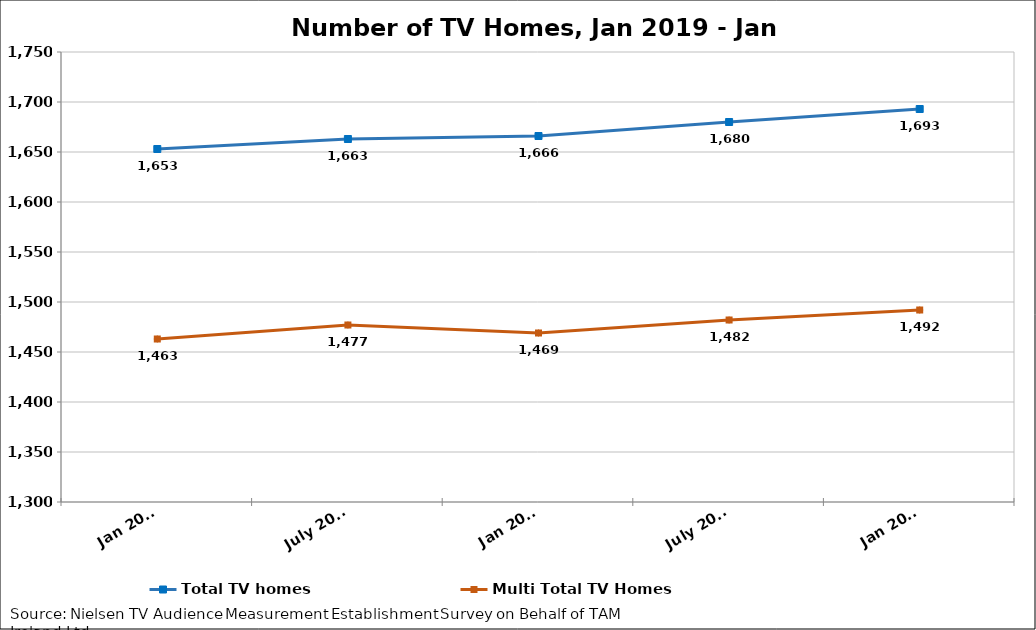
| Category | Total TV homes | Multi Total TV Homes |
|---|---|---|
| Jan 2019 | 1653 | 1463 |
| July 2019 | 1663 | 1477 |
| Jan 2020 | 1666 | 1469 |
| July 2020 | 1680 | 1482 |
| Jan 2021 | 1693 | 1492 |